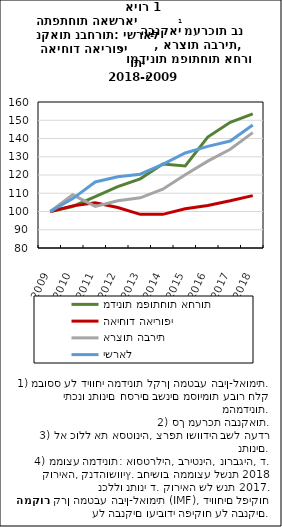
| Category | מדינות מפותחות אחרות | האיחוד האירופי | ארצות הברית | ישראל |
|---|---|---|---|---|
| 2009.0 | 100 | 100 | 100 | 100 |
| 2010.0 | 102.747 | 103.092 | 109.125 | 107.062 |
| 2011.0 | 108.086 | 104.843 | 102.81 | 116.164 |
| 2012.0 | 113.664 | 102.164 | 105.92 | 119.044 |
| 2013.0 | 117.878 | 98.446 | 107.486 | 120.443 |
| 2014.0 | 126.01 | 98.448 | 112.211 | 125.818 |
| 2015.0 | 124.931 | 101.495 | 120.094 | 132.075 |
| 2016.0 | 140.774 | 103.335 | 127.575 | 135.684 |
| 2017.0 | 148.856 | 105.856 | 134.135 | 138.6 |
| 2018.0 | 153.522 | 108.698 | 143.21 | 147.374 |